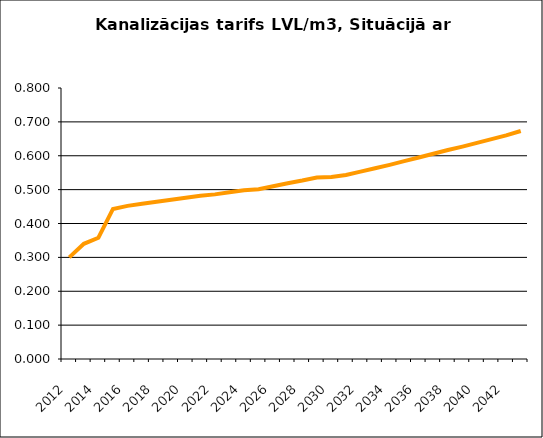
| Category | Series 0 |
|---|---|
| 2012.0 | 0.3 |
| 2013.0 | 0.34 |
| 2014.0 | 0.358 |
| 2015.0 | 0.443 |
| 2016.0 | 0.452 |
| 2017.0 | 0.458 |
| 2018.0 | 0.464 |
| 2019.0 | 0.47 |
| 2020.0 | 0.476 |
| 2021.0 | 0.482 |
| 2022.0 | 0.486 |
| 2023.0 | 0.492 |
| 2024.0 | 0.498 |
| 2025.0 | 0.501 |
| 2026.0 | 0.51 |
| 2027.0 | 0.519 |
| 2028.0 | 0.527 |
| 2029.0 | 0.536 |
| 2030.0 | 0.537 |
| 2031.0 | 0.543 |
| 2032.0 | 0.553 |
| 2033.0 | 0.563 |
| 2034.0 | 0.573 |
| 2035.0 | 0.584 |
| 2036.0 | 0.595 |
| 2037.0 | 0.606 |
| 2038.0 | 0.617 |
| 2039.0 | 0.627 |
| 2040.0 | 0.638 |
| 2041.0 | 0.649 |
| 2042.0 | 0.66 |
| 2043.0 | 0.673 |